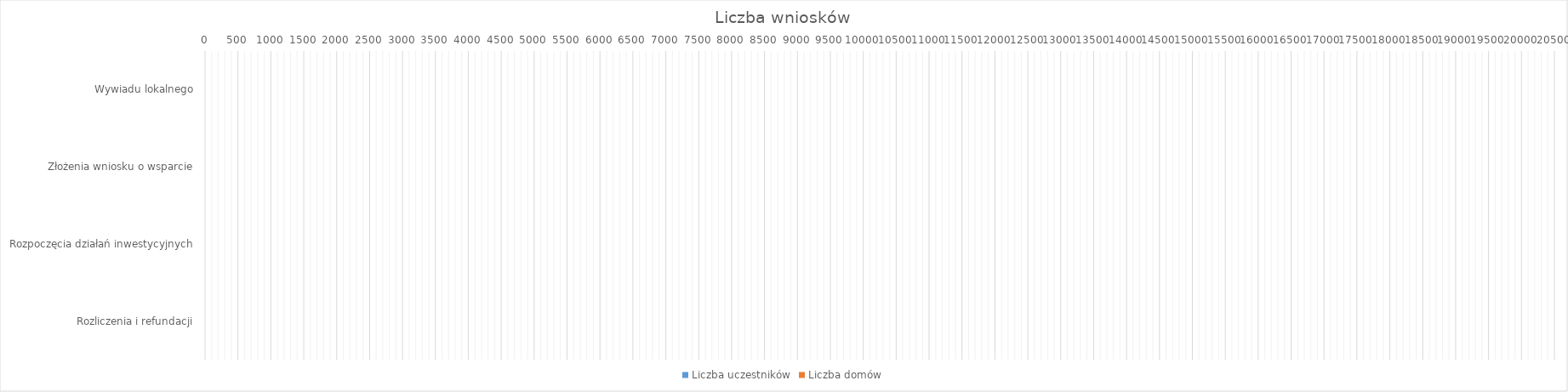
| Category | Liczba uczestników | Liczba domów |
|---|---|---|
| Wywiadu lokalnego | 0 | 0 |
| Złożenia wniosku o wsparcie | 0 | 0 |
| Rozpoczęcia działań inwestycyjnych | 0 | 0 |
| Rozliczenia i refundacji | 0 | 0 |